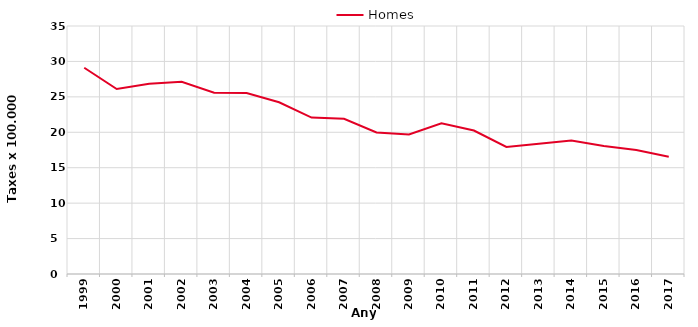
| Category | Homes |
|---|---|
| 1999.0 | 29.11 |
| 2000.0 | 26.1 |
| 2001.0 | 26.85 |
| 2002.0 | 27.12 |
| 2003.0 | 25.58 |
| 2004.0 | 25.54 |
| 2005.0 | 24.23 |
| 2006.0 | 22.08 |
| 2007.0 | 21.91 |
| 2008.0 | 19.97 |
| 2009.0 | 19.69 |
| 2010.0 | 21.28 |
| 2011.0 | 20.25 |
| 2012.0 | 17.93 |
| 2013.0 | 18.38 |
| 2014.0 | 18.83 |
| 2015.0 | 18.08 |
| 2016.0 | 17.49 |
| 2017.0 | 16.56 |